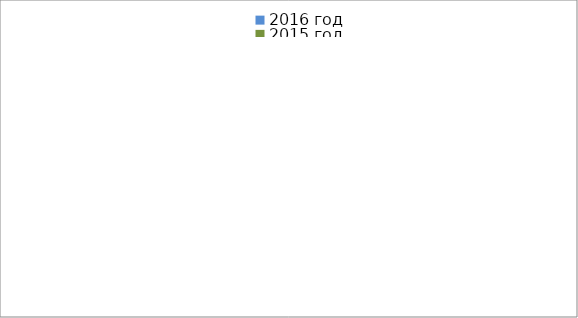
| Category | 2016 год | 2015 год |
|---|---|---|
|  - поджог | 2 | 15 |
|  - неосторожное обращение с огнём | 0 | 6 |
|  - НПТЭ электрооборудования | 1 | 2 |
|  - НПУ и Э печей | 10 | 11 |
|  - НПУ и Э транспортных средств | 15 | 9 |
|   -Шалость с огнем детей | 0 | 1 |
|  -НППБ при эксплуатации эл.приборов | 10 | 2 |
|  - курение | 3 | 0 |
| - прочие | 18 | 15 |
| - не установленные причины | 0 | 6 |